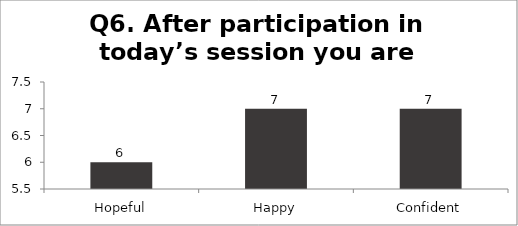
| Category | Q6. After participation in today’s session you are feeling? |
|---|---|
| Hopeful | 6 |
| Happy | 7 |
| Confident | 7 |